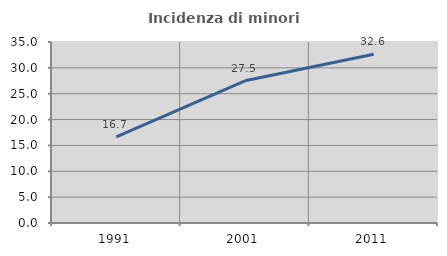
| Category | Incidenza di minori stranieri |
|---|---|
| 1991.0 | 16.667 |
| 2001.0 | 27.5 |
| 2011.0 | 32.624 |